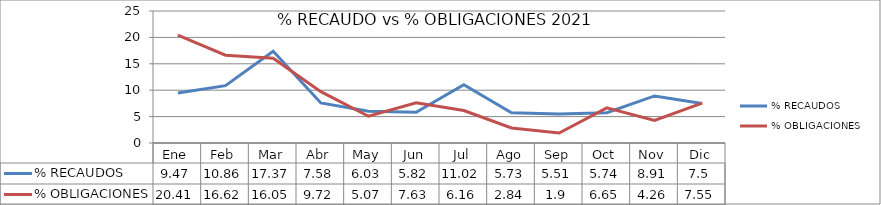
| Category | % RECAUDOS | % OBLIGACIONES |
|---|---|---|
| Ene | 9.47 | 20.41 |
| Feb | 10.86 | 16.62 |
| Mar | 17.37 | 16.05 |
| Abr | 7.58 | 9.72 |
| May | 6.03 | 5.07 |
| Jun | 5.82 | 7.63 |
| Jul | 11.02 | 6.16 |
| Ago | 5.73 | 2.84 |
| Sep | 5.51 | 1.9 |
| Oct | 5.74 | 6.65 |
| Nov | 8.91 | 4.26 |
| Dic | 7.5 | 7.55 |